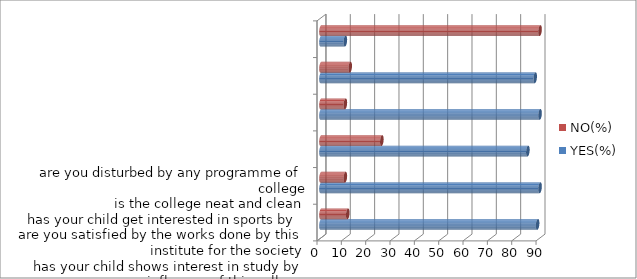
| Category | YES(%) | NO(%) |
|---|---|---|
| 0 | 89 | 11 |
| 1 | 90 | 10 |
| 2 | 85 | 25 |
| 3 | 90 | 10 |
| 4 | 88 | 12 |
| 5 | 10 | 90 |